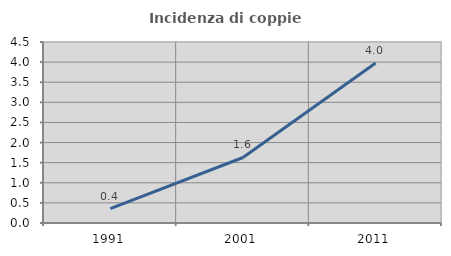
| Category | Incidenza di coppie miste |
|---|---|
| 1991.0 | 0.356 |
| 2001.0 | 1.629 |
| 2011.0 | 3.977 |